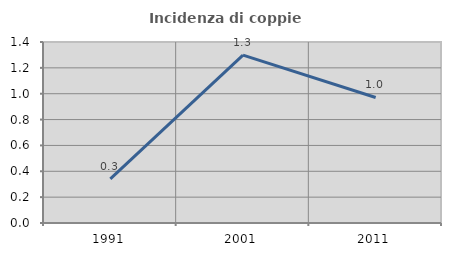
| Category | Incidenza di coppie miste |
|---|---|
| 1991.0 | 0.341 |
| 2001.0 | 1.299 |
| 2011.0 | 0.971 |